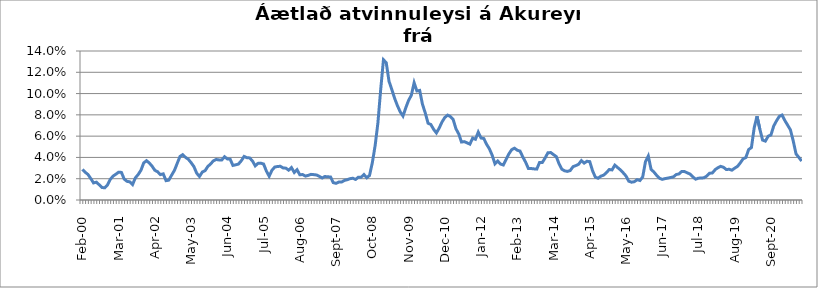
| Category | Series 0 |
|---|---|
| feb.00 | 0.029 |
| mar.00 | 0.026 |
| apr.00 | 0.024 |
| maí.00 | 0.02 |
| jún.00 | 0.016 |
| júl.00 | 0.017 |
| ágú.00 | 0.014 |
| sep.00 | 0.012 |
| okt.00 | 0.011 |
| nóv.00 | 0.014 |
| des.00 | 0.019 |
| jan.01 | 0.022 |
| feb.01 | 0.024 |
| mar.01 | 0.026 |
| apr.01 | 0.026 |
| maí.01 | 0.02 |
| jún.01 | 0.018 |
| júl.01 | 0.017 |
| ágú.01 | 0.014 |
| sep.01 | 0.021 |
| okt.01 | 0.024 |
| nóv.01 | 0.028 |
| des.01 | 0.035 |
| jan.02 | 0.037 |
| feb.02 | 0.035 |
| mar.02 | 0.032 |
| apr.02 | 0.028 |
| maí.02 | 0.027 |
| jún.02 | 0.024 |
| júl.02 | 0.025 |
| ágú.02 | 0.018 |
| sep.02 | 0.019 |
| okt.02 | 0.023 |
| nóv.02 | 0.028 |
| des.02 | 0.034 |
| jan.03 | 0.041 |
| feb.03 | 0.043 |
| mar.03 | 0.04 |
| apr.03 | 0.038 |
| maí.03 | 0.035 |
| jún.03 | 0.031 |
| júl.03 | 0.025 |
| ágú.03 | 0.022 |
| sep.03 | 0.026 |
| okt.03 | 0.028 |
| nóv.03 | 0.032 |
| des.03 | 0.034 |
| jan.04 | 0.037 |
| feb.04 | 0.038 |
| mar.04 | 0.038 |
| apr.04 | 0.038 |
| maí.04 | 0.041 |
| jún.04 | 0.039 |
| júl.04 | 0.038 |
| ágú.04 | 0.032 |
| sep.04 | 0.033 |
| okt.04 | 0.034 |
| nóv.04 | 0.037 |
| des.04 | 0.041 |
| jan.05 | 0.04 |
| feb.05 | 0.04 |
| mar.05 | 0.037 |
| apr.05 | 0.032 |
| maí.05 | 0.034 |
| jún.05 | 0.035 |
| júl.05 | 0.034 |
| ágú.05 | 0.027 |
| sep.05 | 0.022 |
| okt.05 | 0.028 |
| nóv.05 | 0.031 |
| des.05 | 0.031 |
| jan.06 | 0.032 |
| feb.06 | 0.03 |
| mar.06 | 0.03 |
| apr.06 | 0.028 |
| maí.06 | 0.03 |
| jún.06 | 0.026 |
| júl.06 | 0.028 |
| ágú.06 | 0.024 |
| sep.06 | 0.024 |
| okt.06 | 0.022 |
| nóv.06 | 0.023 |
| des.06 | 0.024 |
| jan.07 | 0.024 |
| feb.07 | 0.024 |
| mar.07 | 0.022 |
| apr.07 | 0.021 |
| maí.07 | 0.022 |
| jún.07 | 0.022 |
| júl.07 | 0.022 |
| ágú.07 | 0.016 |
| sep.07 | 0.016 |
| okt.07 | 0.017 |
| nóv.07 | 0.017 |
| des.07 | 0.018 |
| jan.08 | 0.019 |
| feb.08 | 0.02 |
| mar.08 | 0.02 |
| apr.08 | 0.019 |
| maí.08 | 0.021 |
| jún.08 | 0.021 |
| júl.08 | 0.024 |
| ágú.08 | 0.021 |
| sep.08 | 0.023 |
| okt.08 | 0.035 |
| nóv.08 | 0.051 |
| des.08 | 0.072 |
| jan.09 | 0.104 |
| feb.09 | 0.132 |
| mar.09 | 0.129 |
| apr.09 | 0.111 |
| maí.09 | 0.104 |
| jún.09 | 0.096 |
| júl.09 | 0.089 |
| ágú.09 | 0.083 |
| sep.09 | 0.079 |
| okt.09 | 0.087 |
| nóv.09 | 0.094 |
| des.09 | 0.098 |
| jan.10 | 0.11 |
| feb.10 | 0.102 |
| mar.10 | 0.103 |
| apr.10 | 0.09 |
| maí.10 | 0.082 |
| jún.10 | 0.072 |
| júl.10 | 0.071 |
| ágú.10 | 0.066 |
| sep.10 | 0.063 |
| okt.10 | 0.068 |
| nóv.10 | 0.073 |
| des.10 | 0.077 |
| jan.11 | 0.08 |
| feb.11 | 0.078 |
| mar.11 | 0.076 |
| apr.11 | 0.067 |
| maí.11 | 0.062 |
| jún.11 | 0.054 |
| júl.11 | 0.055 |
| ágú.11 | 0.054 |
| sep.11 | 0.052 |
| okt.11 | 0.058 |
| nóv.11 | 0.057 |
| des.11 | 0.064 |
| jan.12 | 0.058 |
| feb.12 | 0.058 |
| mar.12 | 0.052 |
| apr.12 | 0.048 |
| maí.12 | 0.042 |
| jún.12 | 0.034 |
| júl.12 | 0.037 |
| ágú.12 | 0.034 |
| sep.12 | 0.033 |
| okt.12 | 0.038 |
| nóv.12 | 0.043 |
| des.12 | 0.047 |
| jan.13 | 0.049 |
| feb.13 | 0.047 |
| mar.13 | 0.046 |
| apr.13 | 0.04 |
| maí.13 | 0.036 |
| jún.13 | 0.03 |
| júl.13 | 0.03 |
| ágú.13 | 0.029 |
| sep.13 | 0.029 |
| okt.13 | 0.035 |
| nóv.13 | 0.035 |
| des.13 | 0.039 |
| jan.14 | 0.044 |
| feb.14 | 0.045 |
| mar.14 | 0.043 |
| apr.14 | 0.041 |
| maí.14 | 0.034 |
| jún.14 | 0.029 |
| júl.14 | 0.027 |
| ágú.14 | 0.027 |
| sep.14 | 0.028 |
| okt.14 | 0.031 |
| nóv.14 | 0.032 |
| des.14 | 0.034 |
| jan.15 | 0.037 |
| feb.15 | 0.035 |
| mar.15 | 0.036 |
| apr.15 | 0.036 |
| maí.15 | 0.028 |
| jún.15 | 0.021 |
| júl.15 | 0.02 |
| ágú.15 | 0.022 |
| sep.15 | 0.023 |
| okt.15 | 0.026 |
| nóv.15 | 0.029 |
| des.15 | 0.028 |
| jan.16 | 0.033 |
| feb.16 | 0.03 |
| mar.16 | 0.028 |
| apr.16 | 0.026 |
| maí.16 | 0.023 |
| jún.16 | 0.018 |
| júl.16 | 0.017 |
| ágú.16 | 0.017 |
| sep.16 | 0.019 |
| okt.16 | 0.018 |
| nóv.16 | 0.022 |
| des.16 | 0.036 |
| jan.17 | 0.041 |
| feb.17 | 0.029 |
| mar.17 | 0.026 |
| apr.17 | 0.023 |
| maí.17 | 0.02 |
| jún.17 | 0.019 |
| júl.17 | 0.02 |
| ágú.17 | 0.021 |
| sep.17 | 0.021 |
| okt.17 | 0.022 |
| nóv.17 | 0.024 |
| des.17 | 0.024 |
| jan.18 | 0.027 |
| feb.18 | 0.027 |
| mar.18 | 0.025 |
| apr.18 | 0.024 |
| maí.18 | 0.022 |
| jún.18 | 0.02 |
| júl.18 | 0.021 |
| ágú.18 | 0.021 |
| sep.18 | 0.021 |
| okt.18 | 0.023 |
| nóv.18 | 0.025 |
| des.18 | 0.025 |
| jan.19 | 0.029 |
| feb.19 | 0.03 |
| mar.19 | 0.032 |
| apr.19 | 0.031 |
| maí.19 | 0.029 |
| jún.19 | 0.029 |
| júl.19 | 0.028 |
| ágú.19 | 0.03 |
| sep.19 | 0.032 |
| okt.19 | 0.035 |
| nóv.19 | 0.039 |
| des.19 | 0.04 |
| jan.20 | 0.047 |
| feb.20 | 0.049 |
| mars 2020*** | 0.068 |
| apr.20 | 0.079 |
| maí.20 | 0.067 |
| jún.20 | 0.056 |
| júl.20 | 0.055 |
| ágú.20 | 0.06 |
| sep.20 | 0.061 |
| okt.20 | 0.07 |
| nóv.20 | 0.074 |
| des.20 | 0.079 |
| jan.21 | 0.08 |
| feb.21 | 0.075 |
| mar.21 | 0.07 |
| apr.21 | 0.066 |
| maí.21 | 0.055 |
| jún.21 | 0.043 |
| júl.21 | 0.04 |
| ágú.21 | 0.037 |